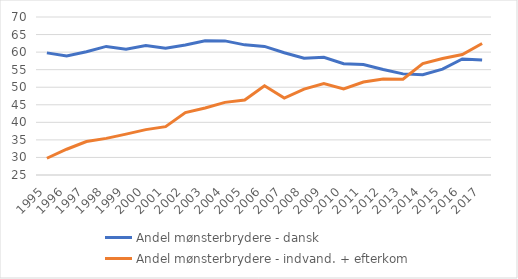
| Category | Andel mønsterbrydere - dansk | Andel mønsterbrydere - indvand. + efterkom |
|---|---|---|
| 1995 | 59.781 | 29.769 |
| 1996 | 58.871 | 32.336 |
| 1997 | 60.087 | 34.54 |
| 1998 | 61.621 | 35.428 |
| 1999 | 60.842 | 36.635 |
| 2000 | 61.878 | 37.925 |
| 2001 | 61.076 | 38.768 |
| 2002 | 62.018 | 42.773 |
| 2003 | 63.232 | 44.089 |
| 2004 | 63.198 | 45.689 |
| 2005 | 62.067 | 46.36 |
| 2006 | 61.632 | 50.414 |
| 2007 | 59.818 | 46.913 |
| 2008 | 58.241 | 49.478 |
| 2009 | 58.502 | 51.069 |
| 2010 | 56.672 | 49.528 |
| 2011 | 56.441 | 51.49 |
| 2012 | 55.039 | 52.367 |
| 2013 | 53.8 | 52.261 |
| 2014 | 53.541 | 56.749 |
| 2015 | 55.165 | 58.196 |
| 2016 | 58.037 | 59.296 |
| 2017 | 57.778 | 62.446 |